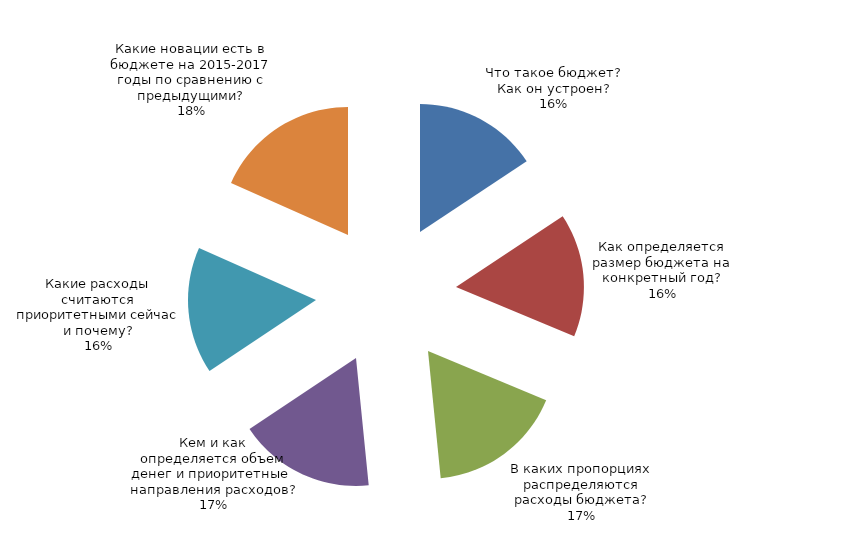
| Category | Series 0 |
|---|---|
| Что такое бюджет? Как он устроен? | 4256 |
| Как определяется размер бюджета на конкретный год? | 4235 |
| В каких пропорциях распределяются расходы бюджета? | 4652 |
| Кем и как определяется объем денег и приоритетные  направления расходов? | 4675 |
| Какие расходы считаются приоритетными сейчас и почему? | 4347 |
| Какие новации есть в бюджете на 2015-2017 годы по сравнению с предыдущими? | 4980 |